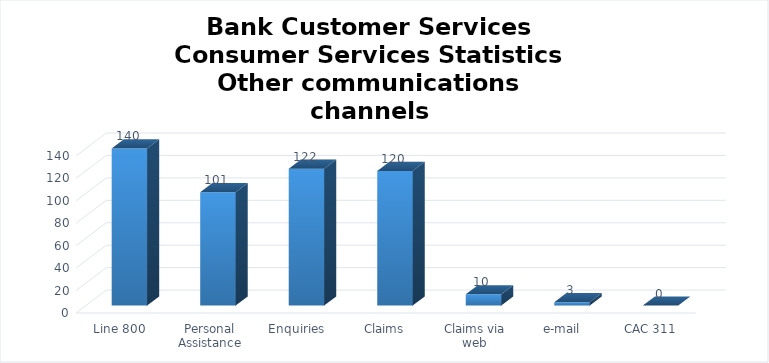
| Category | Series 0 |
|---|---|
| Line 800 | 140 |
| Personal Assistance | 101 |
| Enquiries | 122 |
| Claims | 120 |
| Claims via web | 10 |
| e-mail | 3 |
| CAC 311 | 0 |